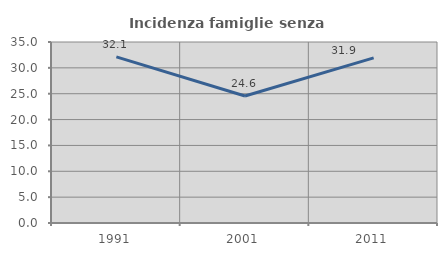
| Category | Incidenza famiglie senza nuclei |
|---|---|
| 1991.0 | 32.132 |
| 2001.0 | 24.551 |
| 2011.0 | 31.921 |